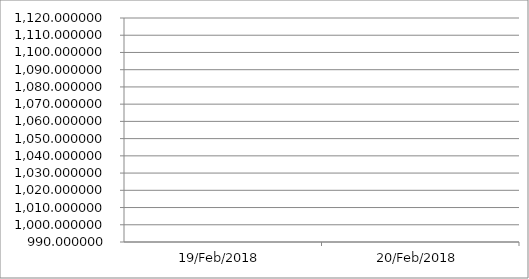
| Category | Series 0 |
|---|---|
| 2018-02-19 | 10000 |
| 2018-02-20 | 10000 |